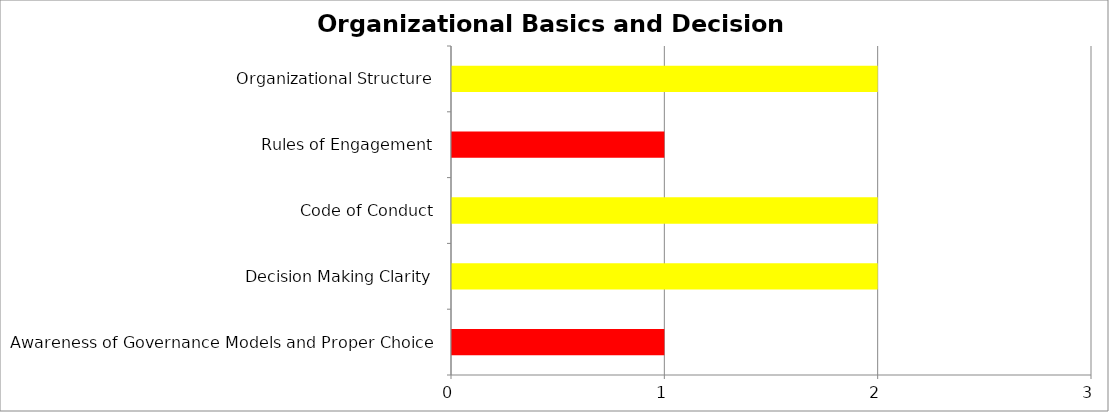
| Category | Series 0 | Series 1 | Series 2 |
|---|---|---|---|
| Awareness of Governance Models and Proper Choice | 0 | 0 | 1 |
| Decision Making Clarity | 0 | 2 | 0 |
| Code of Conduct | 0 | 2 | 0 |
| Rules of Engagement | 0 | 0 | 1 |
| Organizational Structure | 0 | 2 | 0 |